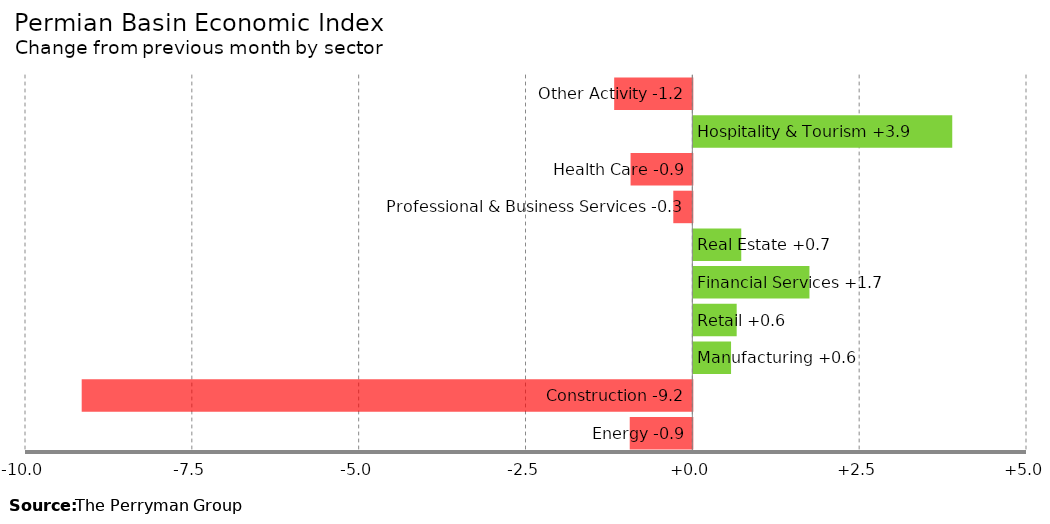
| Category | Change |
|---|---|
| Energy | -0.938 |
| Construction | -9.15 |
| Manufacturing | 0.565 |
| Retail | 0.65 |
| Financial Services | 1.74 |
| Real Estate | 0.718 |
| Professional & Business Services | -0.285 |
| Health Care | -0.926 |
| Hospitality & Tourism | 3.88 |
| Other Activity | -1.171 |